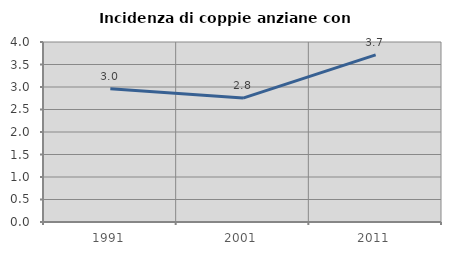
| Category | Incidenza di coppie anziane con figli |
|---|---|
| 1991.0 | 2.961 |
| 2001.0 | 2.754 |
| 2011.0 | 3.713 |